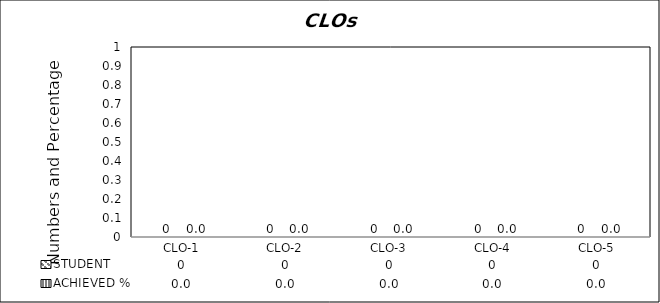
| Category | STUDENT | ACHIEVED % |
|---|---|---|
| CLO-1 | 0 | 0 |
| CLO-2 | 0 | 0 |
| CLO-3 | 0 | 0 |
| CLO-4 | 0 | 0 |
| CLO-5 | 0 | 0 |